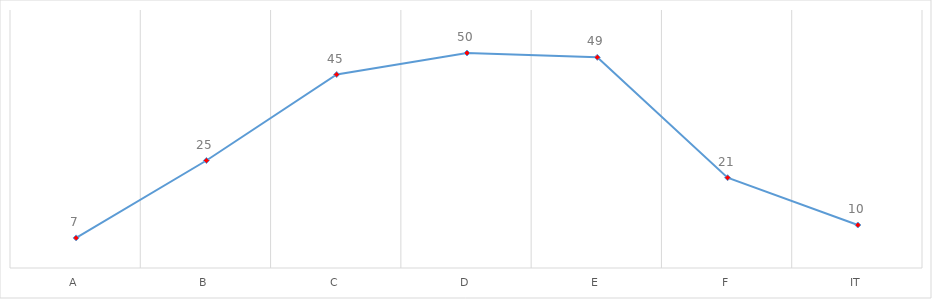
| Category | Total |
|---|---|
| A | 7 |
| B | 25 |
| C | 45 |
| D | 50 |
| E | 49 |
| F | 21 |
| IT | 10 |